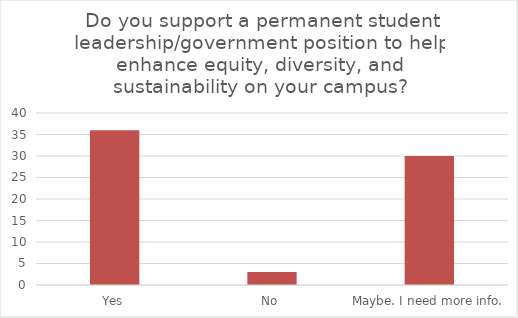
| Category | Series 1 |
|---|---|
| Yes | 36 |
| No | 3 |
| Maybe. I need more info. | 30 |